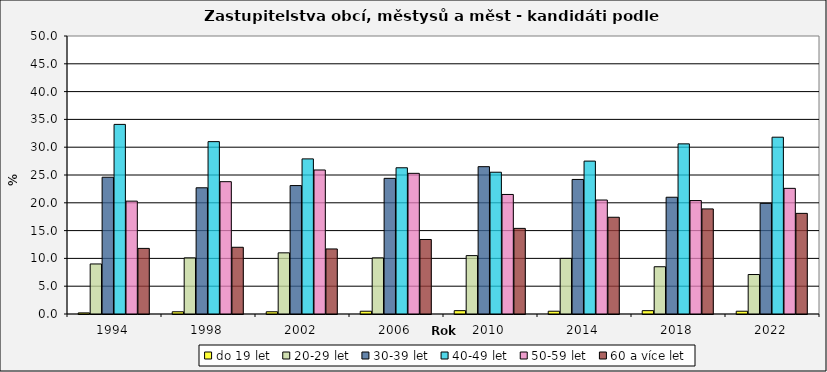
| Category | do 19 let | 20-29 let | 30-39 let | 40-49 let | 50-59 let | 60 a více let |
|---|---|---|---|---|---|---|
| 1994.0 | 0.2 | 9 | 24.6 | 34.1 | 20.3 | 11.8 |
| 1998.0 | 0.4 | 10.1 | 22.7 | 31 | 23.8 | 12 |
| 2002.0 | 0.4 | 11 | 23.1 | 27.9 | 25.9 | 11.7 |
| 2006.0 | 0.5 | 10.1 | 24.4 | 26.3 | 25.3 | 13.4 |
| 2010.0 | 0.6 | 10.5 | 26.5 | 25.5 | 21.5 | 15.4 |
| 2014.0 | 0.5 | 10 | 24.2 | 27.5 | 20.5 | 17.4 |
| 2018.0 | 0.6 | 8.5 | 21 | 30.6 | 20.4 | 18.9 |
| 2022.0 | 0.5 | 7.1 | 19.9 | 31.8 | 22.6 | 18.1 |